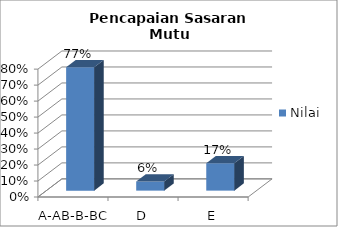
| Category | Nilai |
|---|---|
| A-AB-B-BC-C | 0.771 |
| D | 0.057 |
| E | 0.171 |